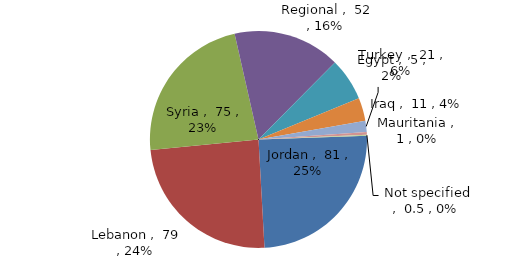
| Category | Series 0 |
|---|---|
| Jordan | 80.567 |
| Lebanon | 79.427 |
| Syria | 75.147 |
| Regional | 52.159 |
| Turkey | 20.778 |
| Iraq | 11.223 |
| Egypt | 5.452 |
| Mauritania | 1.249 |
| Not specified | 0.5 |